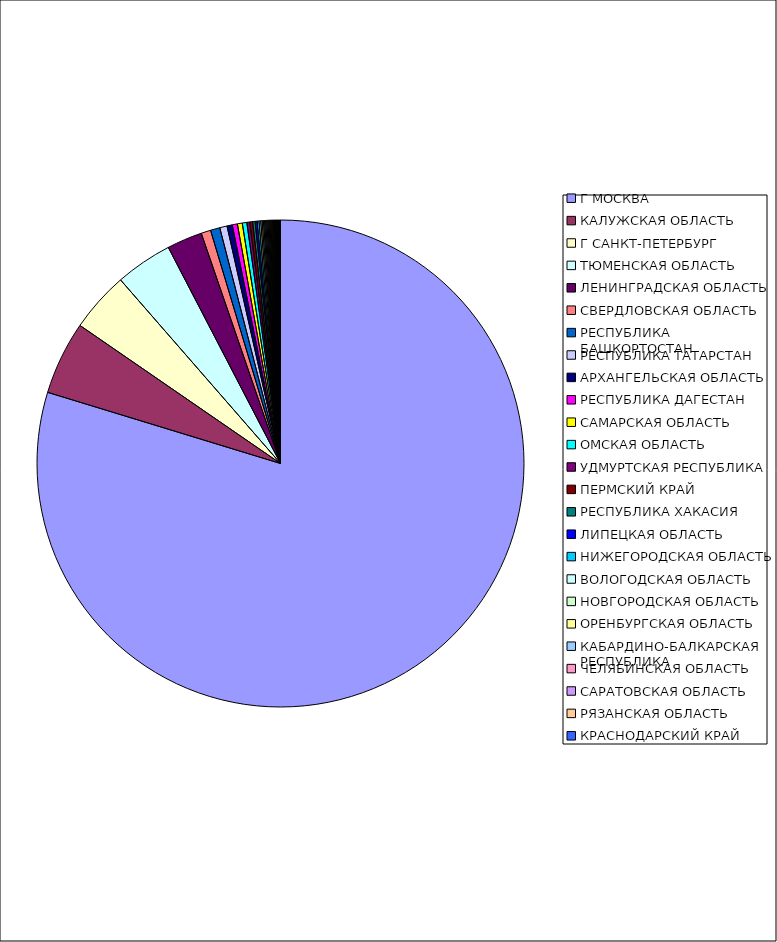
| Category | Оборот |
|---|---|
| Г МОСКВА | 0.797 |
| КАЛУЖСКАЯ ОБЛАСТЬ | 0.049 |
| Г САНКТ-ПЕТЕРБУРГ | 0.04 |
| ТЮМЕНСКАЯ ОБЛАСТЬ | 0.038 |
| ЛЕНИНГРАДСКАЯ ОБЛАСТЬ | 0.023 |
| СВЕРДЛОВСКАЯ ОБЛАСТЬ | 0.006 |
| РЕСПУБЛИКА БАШКОРТОСТАН | 0.006 |
| РЕСПУБЛИКА ТАТАРСТАН | 0.005 |
| АРХАНГЕЛЬСКАЯ ОБЛАСТЬ | 0.003 |
| РЕСПУБЛИКА ДАГЕСТАН | 0.003 |
| САМАРСКАЯ ОБЛАСТЬ | 0.003 |
| ОМСКАЯ ОБЛАСТЬ | 0.003 |
| УДМУРТСКАЯ РЕСПУБЛИКА | 0.002 |
| ПЕРМСКИЙ КРАЙ | 0.002 |
| РЕСПУБЛИКА ХАКАСИЯ | 0.002 |
| ЛИПЕЦКАЯ ОБЛАСТЬ | 0.001 |
| НИЖЕГОРОДСКАЯ ОБЛАСТЬ | 0.001 |
| ВОЛОГОДСКАЯ ОБЛАСТЬ | 0.001 |
| НОВГОРОДСКАЯ ОБЛАСТЬ | 0.001 |
| ОРЕНБУРГСКАЯ ОБЛАСТЬ | 0.001 |
| КАБАРДИНО-БАЛКАРСКАЯ РЕСПУБЛИКА | 0.001 |
| ЧЕЛЯБИНСКАЯ ОБЛАСТЬ | 0.001 |
| САРАТОВСКАЯ ОБЛАСТЬ | 0.001 |
| РЯЗАНСКАЯ ОБЛАСТЬ | 0.001 |
| КРАСНОДАРСКИЙ КРАЙ | 0.001 |
| БЕЛГОРОДСКАЯ ОБЛАСТЬ | 0.001 |
| КАЛИНИНГРАДСКАЯ ОБЛАСТЬ | 0.001 |
| РОСТОВСКАЯ ОБЛАСТЬ | 0.001 |
| РЕСПУБЛИКА СЕВЕРНАЯ ОСЕТИЯ-АЛАНИЯ | 0.001 |
| УЛЬЯНОВСКАЯ ОБЛАСТЬ | 0.001 |
| РЕСПУБЛИКА КОМИ | 0.001 |
| ИВАНОВСКАЯ ОБЛАСТЬ | 0.001 |
| НОВОСИБИРСКАЯ ОБЛАСТЬ | 0 |
| ПСКОВСКАЯ ОБЛАСТЬ | 0 |
| СМОЛЕНСКАЯ ОБЛАСТЬ | 0 |
| РЕСПУБЛИКА МОРДОВИЯ | 0 |
| РЕСПУБЛИКА КАРЕЛИЯ | 0 |
| КИРОВСКАЯ ОБЛАСТЬ | 0 |
| ТУЛЬСКАЯ ОБЛАСТЬ | 0 |
| ИРКУТСКАЯ ОБЛАСТЬ | 0 |
| КУРСКАЯ ОБЛАСТЬ | 0 |
| СТАВРОПОЛЬСКИЙ КРАЙ | 0 |
| ПРИМОРСКИЙ КРАЙ | 0 |
| ЧУВАШСКАЯ РЕСПУБЛИКА | 0 |
| КЕМЕРОВСКАЯ ОБЛАСТЬ | 0 |
| АЛТАЙСКИЙ КРАЙ | 0 |